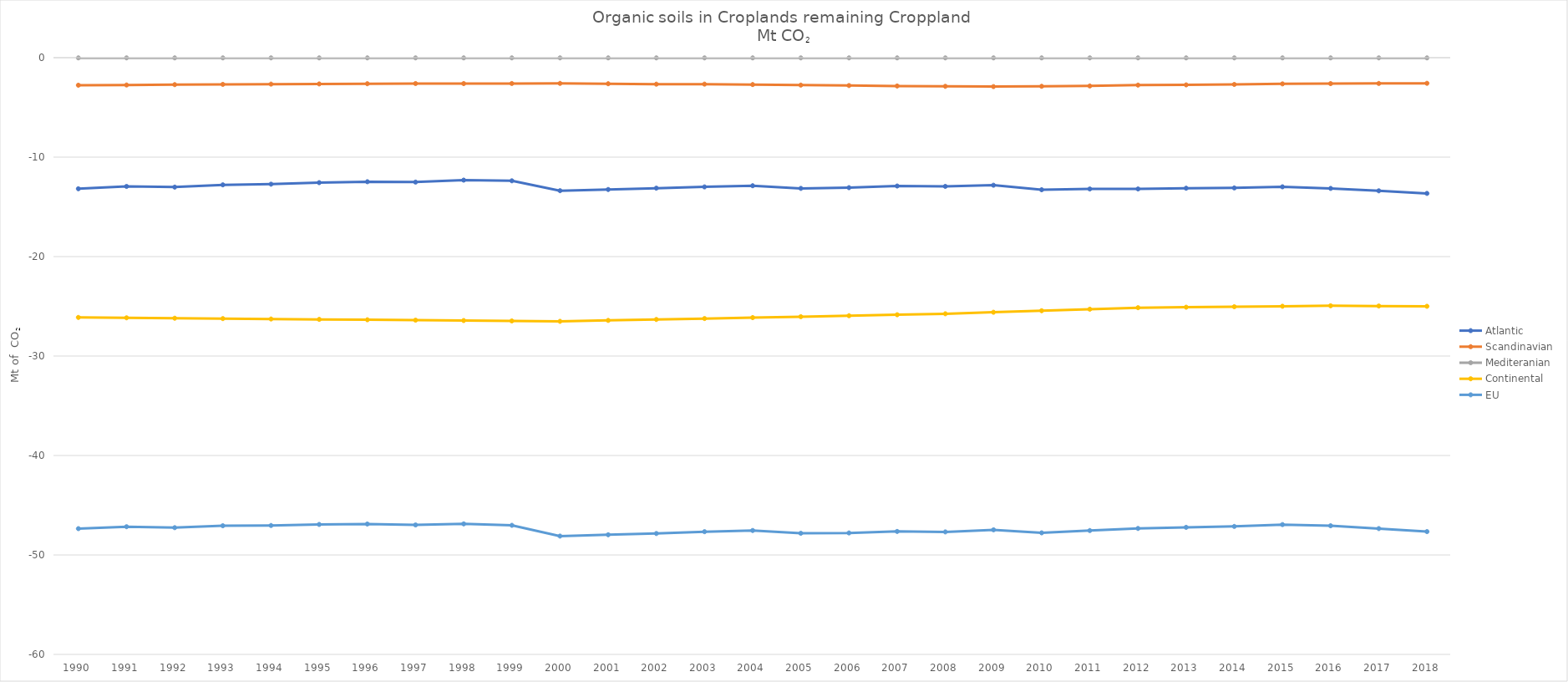
| Category | Atlantic | Scandinavian | Mediteranian | Continental | EU |
|---|---|---|---|---|---|
| 1990 | -13.181 | -2.768 | -0.021 | -26.117 | -47.354 |
| 1991 | -12.947 | -2.747 | -0.021 | -26.156 | -47.161 |
| 1992 | -13.014 | -2.711 | -0.021 | -26.196 | -47.255 |
| 1993 | -12.786 | -2.684 | -0.021 | -26.235 | -47.062 |
| 1994 | -12.72 | -2.658 | -0.021 | -26.274 | -47.036 |
| 1995 | -12.565 | -2.639 | -0.021 | -26.313 | -46.931 |
| 1996 | -12.473 | -2.621 | -0.021 | -26.353 | -46.888 |
| 1997 | -12.509 | -2.602 | -0.021 | -26.392 | -46.982 |
| 1998 | -12.311 | -2.608 | -0.021 | -26.431 | -46.874 |
| 1999 | -12.38 | -2.597 | -0.021 | -26.47 | -47.02 |
| 2000 | -13.375 | -2.585 | -0.021 | -26.51 | -48.101 |
| 2001 | -13.254 | -2.621 | -0.021 | -26.416 | -47.969 |
| 2002 | -13.121 | -2.664 | -0.021 | -26.323 | -47.844 |
| 2003 | -12.994 | -2.659 | -0.021 | -26.23 | -47.661 |
| 2004 | -12.877 | -2.704 | -0.021 | -26.136 | -47.539 |
| 2005 | -13.144 | -2.757 | -0.021 | -26.042 | -47.819 |
| 2006 | -13.07 | -2.804 | -0.021 | -25.945 | -47.786 |
| 2007 | -12.905 | -2.848 | -0.021 | -25.847 | -47.635 |
| 2008 | -12.941 | -2.882 | -0.021 | -25.749 | -47.682 |
| 2009 | -12.824 | -2.908 | -0.021 | -25.596 | -47.471 |
| 2010 | -13.279 | -2.879 | -0.021 | -25.444 | -47.776 |
| 2011 | -13.203 | -2.843 | -0.021 | -25.291 | -47.544 |
| 2012 | -13.2 | -2.757 | -0.021 | -25.138 | -47.334 |
| 2013 | -13.125 | -2.737 | -0.021 | -25.09 | -47.224 |
| 2014 | -13.095 | -2.692 | -0.021 | -25.041 | -47.129 |
| 2015 | -12.985 | -2.635 | -0.021 | -24.993 | -46.946 |
| 2016 | -13.145 | -2.609 | -0.021 | -24.944 | -47.064 |
| 2017 | -13.388 | -2.592 | -0.021 | -24.971 | -47.347 |
| 2018 | -13.646 | -2.578 | -0.021 | -24.997 | -47.651 |